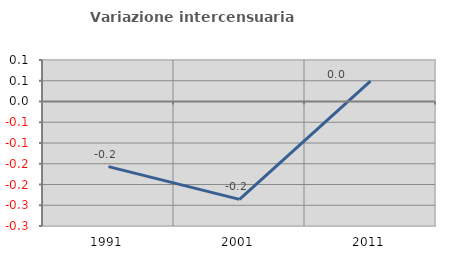
| Category | Variazione intercensuaria annua |
|---|---|
| 1991.0 | -0.157 |
| 2001.0 | -0.236 |
| 2011.0 | 0.049 |